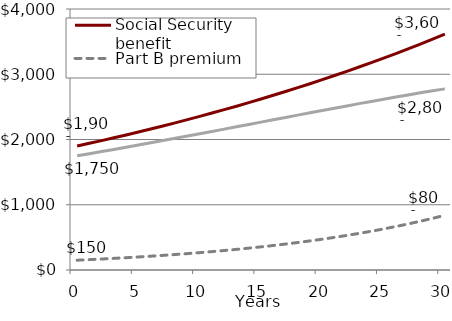
| Category | Social Security benefit | Part B premium | Net benefit |
|---|---|---|---|
| 0.0 | 1900 | 150 | 1750 |
| 1.0 | 1941.167 | 158.856 | 1782.31 |
| 2.0 | 1983.225 | 168.236 | 1814.99 |
| 3.0 | 2026.195 | 178.169 | 1848.027 |
| 4.0 | 2070.096 | 188.688 | 1881.408 |
| 5.0 | 2114.948 | 199.829 | 1915.119 |
| 6.0 | 2160.772 | 211.627 | 1949.145 |
| 7.0 | 2207.589 | 224.122 | 1983.467 |
| 8.0 | 2255.42 | 237.355 | 2018.065 |
| 9.0 | 2304.287 | 251.369 | 2052.919 |
| 10.0 | 2354.213 | 266.21 | 2088.003 |
| 11.0 | 2405.221 | 281.928 | 2123.294 |
| 12.0 | 2457.335 | 298.573 | 2158.761 |
| 13.0 | 2510.577 | 316.202 | 2194.375 |
| 14.0 | 2564.973 | 334.871 | 2230.102 |
| 15.0 | 2620.547 | 354.643 | 2265.904 |
| 16.0 | 2677.326 | 375.582 | 2301.744 |
| 17.0 | 2735.334 | 397.757 | 2337.578 |
| 18.0 | 2794.6 | 421.241 | 2373.359 |
| 19.0 | 2855.15 | 446.112 | 2409.037 |
| 20.0 | 2917.011 | 472.452 | 2444.559 |
| 21.0 | 2980.213 | 500.346 | 2479.867 |
| 22.0 | 3044.784 | 529.888 | 2514.896 |
| 23.0 | 3110.755 | 561.174 | 2549.581 |
| 24.0 | 3178.154 | 594.307 | 2583.847 |
| 25.0 | 3247.014 | 629.396 | 2617.618 |
| 26.0 | 3317.366 | 666.557 | 2650.809 |
| 27.0 | 3389.243 | 705.912 | 2683.33 |
| 28.0 | 3462.676 | 747.591 | 2715.085 |
| 29.0 | 3537.701 | 791.73 | 2745.97 |
| 30.0 | 3614.351 | 838.476 | 2775.875 |